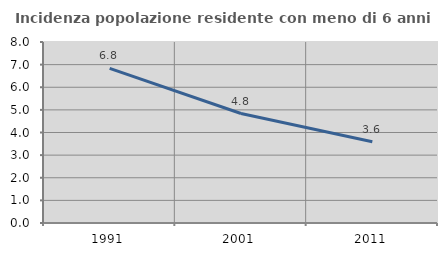
| Category | Incidenza popolazione residente con meno di 6 anni |
|---|---|
| 1991.0 | 6.831 |
| 2001.0 | 4.839 |
| 2011.0 | 3.592 |